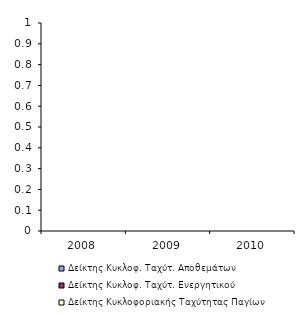
| Category | Δείκτης Κυκλοφ. Ταχύτ. Αποθεμάτων | Δείκτης Κυκλοφ. Ταχύτ. Ενεργητικού | Δείκτης Κυκλοφοριακής Ταχύτητας Παγίων |
|---|---|---|---|
| 2008.0 | 0 | 0 | 0 |
| 2009.0 | 0 | 0 | 0 |
| 2010.0 | 0 | 0 | 0 |